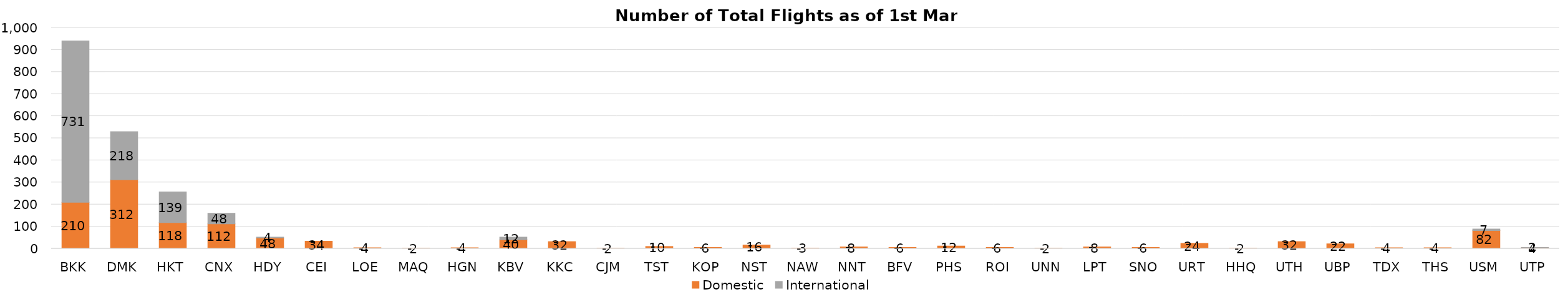
| Category | Domestic | International |
|---|---|---|
| BKK | 210 | 731 |
| DMK | 312 | 218 |
| HKT | 118 | 139 |
| CNX | 112 | 48 |
| HDY | 48 | 4 |
| CEI | 34 | 0 |
| LOE | 4 | 0 |
| MAQ | 2 | 0 |
| HGN | 4 | 0 |
| KBV | 40 | 12 |
| KKC | 32 | 0 |
| CJM | 2 | 0 |
| TST | 10 | 0 |
| KOP | 6 | 0 |
| NST | 16 | 0 |
| NAW | 3 | 0 |
| NNT | 8 | 0 |
| BFV | 6 | 0 |
| PHS | 12 | 0 |
| ROI | 6 | 0 |
| UNN | 2 | 0 |
| LPT | 8 | 0 |
| SNO | 6 | 0 |
| URT | 24 | 0 |
| HHQ | 2 | 0 |
| UTH | 32 | 0 |
| UBP | 22 | 0 |
| TDX | 4 | 0 |
| THS | 4 | 0 |
| USM | 82 | 7 |
| UTP | 4 | 2 |